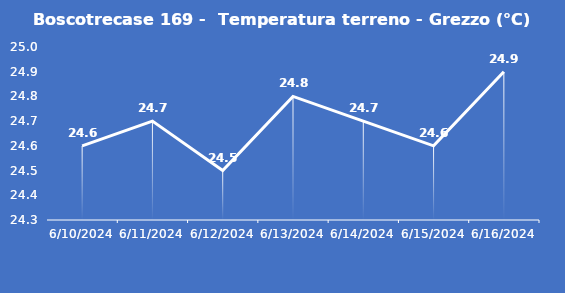
| Category | Boscotrecase 169 -  Temperatura terreno - Grezzo (°C) |
|---|---|
| 6/10/24 | 24.6 |
| 6/11/24 | 24.7 |
| 6/12/24 | 24.5 |
| 6/13/24 | 24.8 |
| 6/14/24 | 24.7 |
| 6/15/24 | 24.6 |
| 6/16/24 | 24.9 |